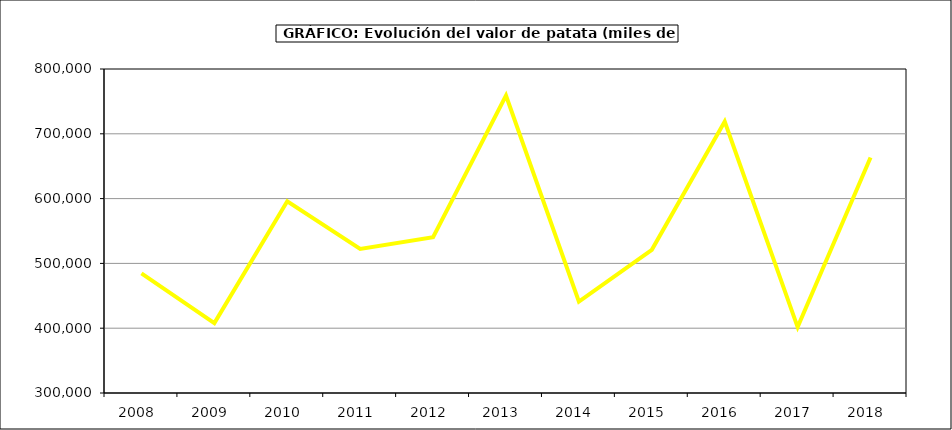
| Category | Valor |
|---|---|
| 2008.0 | 484594.129 |
| 2009.0 | 407893.65 |
| 2010.0 | 595780.386 |
| 2011.0 | 522199.983 |
| 2012.0 | 540398.006 |
| 2013.0 | 759146.328 |
| 2014.0 | 441131.161 |
| 2015.0 | 520997 |
| 2016.0 | 719010 |
| 2017.0 | 401760.918 |
| 2018.0 | 663406.797 |